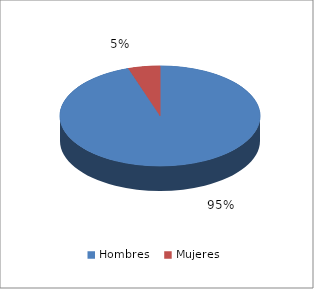
| Category | Series 0 |
|---|---|
| Hombres | 94.84 |
| Mujeres | 5.15 |